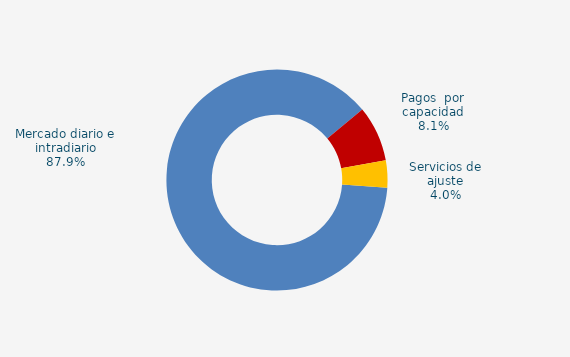
| Category | Series 0 |
|---|---|
| Mercado diario e intradiario | 35.19 |
| Pagos  por capacidad | 3.25 |
| Servicio interrumpibilidad | 0 |
| Servicios de ajuste | 1.59 |